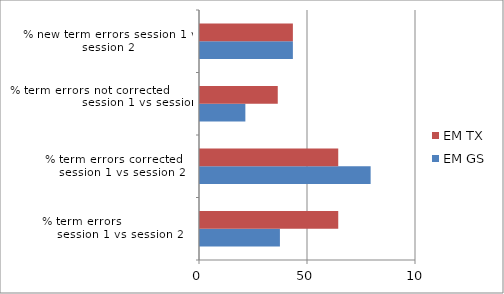
| Category | EM GS | EM TX |
|---|---|---|
| % term errors                       session 1 vs session 2 | 37 | 64 |
| % term errors corrected      session 1 vs session 2 | 79 | 64 |
| % term errors not corrected                            session 1 vs session 3 | 21 | 36 |
| % new term errors session 1 vs session 2 | 43 | 43 |